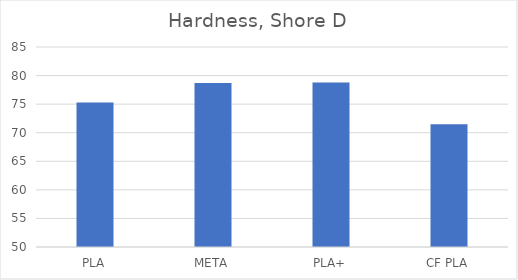
| Category | Shore D |
|---|---|
| PLA | 75.3 |
| META | 78.7 |
| PLA+ | 78.8 |
| CF PLA | 71.5 |